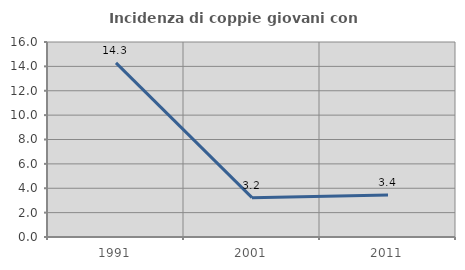
| Category | Incidenza di coppie giovani con figli |
|---|---|
| 1991.0 | 14.286 |
| 2001.0 | 3.226 |
| 2011.0 | 3.448 |